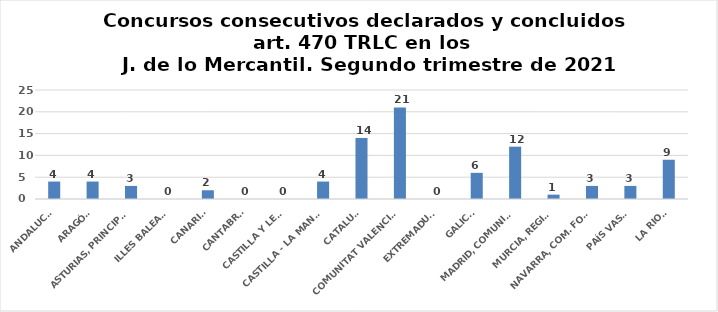
| Category | Series 0 |
|---|---|
| ANDALUCÍA | 4 |
| ARAGÓN | 4 |
| ASTURIAS, PRINCIPADO | 3 |
| ILLES BALEARS | 0 |
| CANARIAS | 2 |
| CANTABRIA | 0 |
| CASTILLA Y LEÓN | 0 |
| CASTILLA - LA MANCHA | 4 |
| CATALUÑA | 14 |
| COMUNITAT VALENCIANA | 21 |
| EXTREMADURA | 0 |
| GALICIA | 6 |
| MADRID, COMUNIDAD | 12 |
| MURCIA, REGIÓN | 1 |
| NAVARRA, COM. FORAL | 3 |
| PAÍS VASCO | 3 |
| LA RIOJA | 9 |